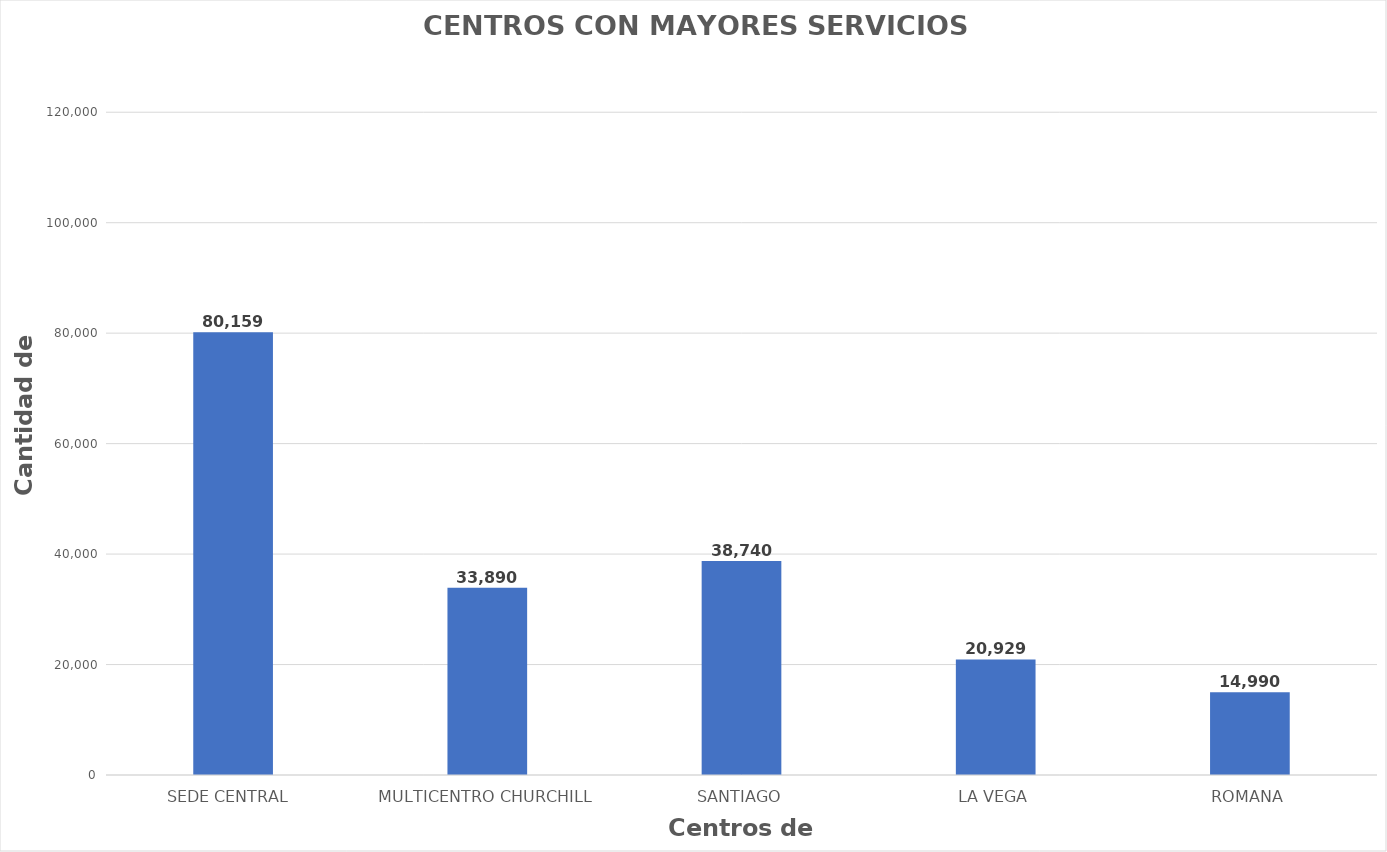
| Category | Series 0 |
|---|---|
| SEDE CENTRAL  | 80159 |
| MULTICENTRO CHURCHILL | 33890 |
| SANTIAGO | 38740 |
| LA VEGA | 20929 |
| ROMANA | 14990 |